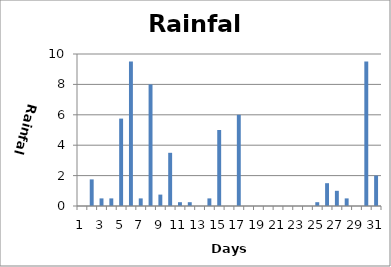
| Category | Series 0 |
|---|---|
| 0 | 0 |
| 1 | 1.75 |
| 2 | 0.5 |
| 3 | 0.5 |
| 4 | 5.75 |
| 5 | 9.5 |
| 6 | 0.5 |
| 7 | 8 |
| 8 | 0.75 |
| 9 | 3.5 |
| 10 | 0.25 |
| 11 | 0.25 |
| 12 | 0 |
| 13 | 0.5 |
| 14 | 5 |
| 15 | 0 |
| 16 | 6 |
| 17 | 0 |
| 18 | 0 |
| 19 | 0 |
| 20 | 0 |
| 21 | 0 |
| 22 | 0 |
| 23 | 0 |
| 24 | 0.25 |
| 25 | 1.5 |
| 26 | 1 |
| 27 | 0.5 |
| 28 | 0 |
| 29 | 9.5 |
| 30 | 2 |